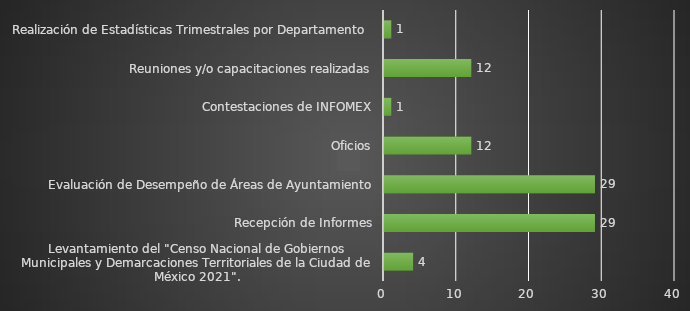
| Category | INDICADOR  |
|---|---|
| Levantamiento del "Censo Nacional de Gobiernos Municipales y Demarcaciones Territoriales de la Ciudad de México 2021". | 4 |
| Recepción de Informes | 29 |
| Evaluación de Desempeño de Áreas de Ayuntamiento | 29 |
| Oficios | 12 |
| Contestaciones de INFOMEX | 1 |
| Reuniones y/o capacitaciones realizadas | 12 |
| Realización de Estadísticas Trimestrales por Departamento  | 1 |